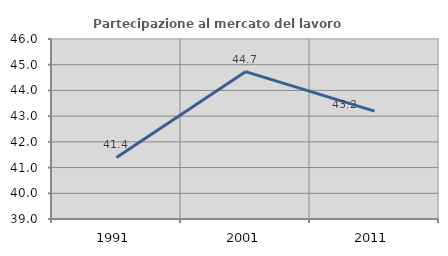
| Category | Partecipazione al mercato del lavoro  femminile |
|---|---|
| 1991.0 | 41.394 |
| 2001.0 | 44.731 |
| 2011.0 | 43.198 |